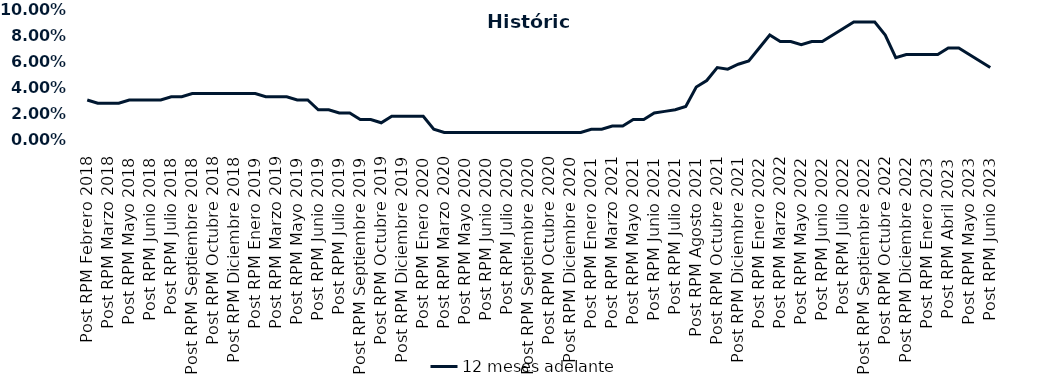
| Category | 12 meses adelante  |
|---|---|
| Post RPM Febrero 2018 | 0.03 |
| Pre RPM Marzo 2018 | 0.028 |
| Post RPM Marzo 2018 | 0.028 |
| Pre RPM Mayo 2018 | 0.028 |
| Post RPM Mayo 2018 | 0.03 |
| Pre RPM Junio 2018 | 0.03 |
| Post RPM Junio 2018 | 0.03 |
| Pre RPM Julio 2018 | 0.03 |
| Post RPM Julio 2018 | 0.032 |
| Pre RPM Septiembre 2018 | 0.032 |
| Post RPM Septiembre 2018 | 0.035 |
| Pre RPM Octubre 2018 | 0.035 |
| Post RPM Octubre 2018 | 0.035 |
| Pre RPM Diciembre 2018 | 0.035 |
| Post RPM Diciembre 2018 | 0.035 |
| Pre RPM Enero 2019 | 0.035 |
| Post RPM Enero 2019 | 0.035 |
| Pre RPM Marzo 2019 | 0.032 |
| Post RPM Marzo 2019 | 0.032 |
| Pre RPM Mayo 2019 | 0.032 |
| Post RPM Mayo 2019 | 0.03 |
| Pre RPM Junio 2019 | 0.03 |
| Post RPM Junio 2019 | 0.022 |
| Pre RPM Julio 2019 | 0.022 |
| Post RPM Julio 2019 | 0.02 |
| Pre RPM Septiembre 2019 | 0.02 |
| Post RPM Septiembre 2019 | 0.015 |
| Pre RPM Octubre 2019 | 0.015 |
| Post RPM Octubre 2019 | 0.012 |
| Pre RPM Diciembre 2019 | 0.018 |
| Post RPM Diciembre 2019 | 0.018 |
| Pre RPM Enero 2020 | 0.018 |
| Post RPM Enero 2020 | 0.018 |
| Pre RPM Marzo 2020 | 0.008 |
| Post RPM Marzo 2020 | 0.005 |
| Pre RPM Mayo 2020 | 0.005 |
| Post RPM Mayo 2020 | 0.005 |
| Pre RPM Junio 2020 | 0.005 |
| Post RPM Junio 2020 | 0.005 |
| Pre RPM Julio 2020 | 0.005 |
| Post RPM Julio 2020 | 0.005 |
| Pre RPM Septiembre 2020 | 0.005 |
| Post RPM Septiembre 2020 | 0.005 |
| Pre RPM Octubre 2020 | 0.005 |
| Post RPM Octubre 2020 | 0.005 |
| Pre RPM Diciembre 2020 | 0.005 |
| Post RPM Diciembre 2020 | 0.005 |
| Pre RPM Enero 2021 | 0.005 |
| Post RPM Enero 2021 | 0.008 |
| Pre RPM Marzo 2021 | 0.008 |
| Post RPM Marzo 2021 | 0.01 |
| Pre RPM Mayo 2021 | 0.01 |
| Post RPM Mayo 2021 | 0.015 |
| Pre RPM Junio 2021 | 0.015 |
| Post RPM Junio 2021 | 0.02 |
| Pre RPM Julio 2021 | 0.021 |
| Post RPM Julio 2021 | 0.022 |
| Pre RPM Agosto 2021 | 0.025 |
| Post RPM Agosto 2021 | 0.04 |
| Pre RPM Octubre 2021 | 0.045 |
| Post RPM Octubre 2021 | 0.055 |
| Pre RPM Diciembre 2021 | 0.054 |
| Post RPM Diciembre 2021 | 0.058 |
| Pre RPM Enero 2022 | 0.06 |
| Post RPM Enero 2022 | 0.07 |
| Pre RPM Marzo 2022 | 0.08 |
| Post RPM Marzo 2022 | 0.075 |
| Pre RPM Mayo 2022 | 0.075 |
| Post RPM Mayo 2022 | 0.072 |
| Pre RPM Junio 2022 | 0.075 |
| Post RPM Junio 2022 | 0.075 |
| Pre RPM Julio 2022 | 0.08 |
| Post RPM Julio 2022 | 0.085 |
| Pre RPM Septiembre 2022 | 0.09 |
| Post RPM Septiembre 2022 | 0.09 |
| Pre RPM Octubre 2022 | 0.09 |
| Post RPM Octubre 2022 | 0.08 |
| Pre RPM Diciembre 2022 | 0.062 |
| Post RPM Diciembre 2022 | 0.065 |
| Pre RPM Enero 2023 | 0.065 |
| Post RPM Enero 2023 | 0.065 |
| Pre RPM Abril 2023 | 0.065 |
| Post RPM Abril 2023 | 0.07 |
| Pre RPM Mayo 2023 | 0.07 |
| Post RPM Mayo 2023 | 0.065 |
| Pre RPM Junio 2023 | 0.06 |
| Post RPM Junio 2023 | 0.055 |